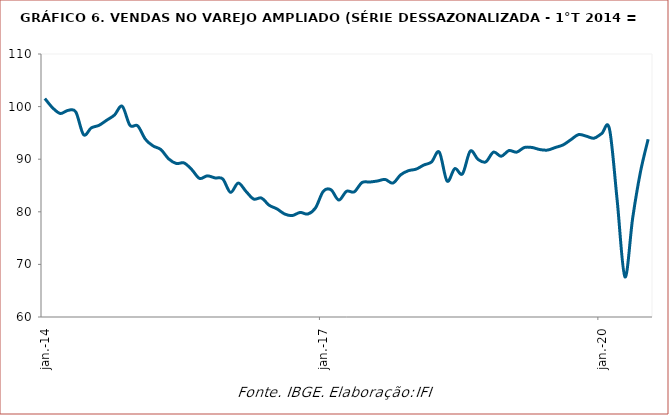
| Category | Vendas |
|---|---|
| 2014-01-01 | 101.535 |
| 2014-02-01 | 99.771 |
| 2014-03-01 | 98.693 |
| 2014-04-01 | 99.281 |
| 2014-05-01 | 98.987 |
| 2014-06-01 | 94.675 |
| 2014-07-01 | 95.949 |
| 2014-08-01 | 96.439 |
| 2014-09-01 | 97.419 |
| 2014-10-01 | 98.399 |
| 2014-11-01 | 100.065 |
| 2014-12-01 | 96.439 |
| 2015-01-01 | 96.341 |
| 2015-02-01 | 93.793 |
| 2015-03-01 | 92.519 |
| 2015-04-01 | 91.833 |
| 2015-05-01 | 90.069 |
| 2015-06-01 | 89.187 |
| 2015-07-01 | 89.285 |
| 2015-08-01 | 88.01 |
| 2015-09-01 | 86.344 |
| 2015-10-01 | 86.834 |
| 2015-11-01 | 86.442 |
| 2015-12-01 | 86.246 |
| 2016-01-01 | 83.698 |
| 2016-02-01 | 85.462 |
| 2016-03-01 | 83.894 |
| 2016-04-01 | 82.424 |
| 2016-05-01 | 82.62 |
| 2016-06-01 | 81.248 |
| 2016-07-01 | 80.562 |
| 2016-08-01 | 79.582 |
| 2016-09-01 | 79.288 |
| 2016-10-01 | 79.876 |
| 2016-11-01 | 79.582 |
| 2016-12-01 | 80.758 |
| 2017-01-01 | 83.894 |
| 2017-02-01 | 84.188 |
| 2017-03-01 | 82.228 |
| 2017-04-01 | 83.894 |
| 2017-05-01 | 83.796 |
| 2017-06-01 | 85.56 |
| 2017-07-01 | 85.658 |
| 2017-08-01 | 85.854 |
| 2017-09-01 | 86.148 |
| 2017-10-01 | 85.462 |
| 2017-11-01 | 87.03 |
| 2017-12-01 | 87.814 |
| 2018-01-01 | 88.108 |
| 2018-02-01 | 88.893 |
| 2018-03-01 | 89.481 |
| 2018-04-01 | 91.343 |
| 2018-05-01 | 85.854 |
| 2018-06-01 | 88.206 |
| 2018-07-01 | 87.226 |
| 2018-08-01 | 91.539 |
| 2018-09-01 | 89.971 |
| 2018-10-01 | 89.481 |
| 2018-11-01 | 91.343 |
| 2018-12-01 | 90.559 |
| 2019-01-01 | 91.637 |
| 2019-02-01 | 91.343 |
| 2019-03-01 | 92.225 |
| 2019-04-01 | 92.225 |
| 2019-05-01 | 91.833 |
| 2019-06-01 | 91.735 |
| 2019-07-01 | 92.225 |
| 2019-08-01 | 92.715 |
| 2019-09-01 | 93.695 |
| 2019-10-01 | 94.675 |
| 2019-11-01 | 94.381 |
| 2019-12-01 | 93.989 |
| 2020-01-01 | 94.871 |
| 2020-02-01 | 95.753 |
| 2020-03-01 | 82.13 |
| 2020-04-01 | 67.625 |
| 2020-05-01 | 78.798 |
| 2020-06-01 | 87.52 |
| 2020-07-01 | 93.793 |